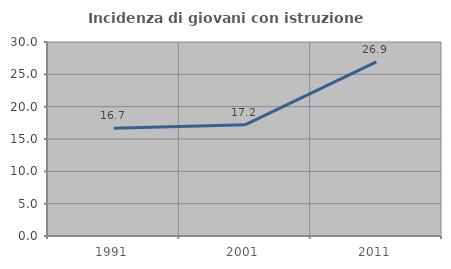
| Category | Incidenza di giovani con istruzione universitaria |
|---|---|
| 1991.0 | 16.667 |
| 2001.0 | 17.188 |
| 2011.0 | 26.923 |